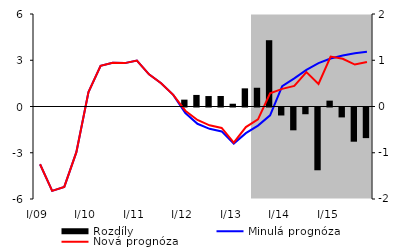
| Category | Rozdíly |
|---|---|
| 0 | 0 |
| 1 | 0 |
| 2 | 0 |
| 3 | 0 |
| 4 | 0 |
| 5 | 0 |
| 6 | 0 |
| 7 | 0 |
| 8 | 0 |
| 9 | 0 |
| 10 | 0 |
| 11 | 0 |
| 12 | 0.148 |
| 13 | 0.25 |
| 14 | 0.226 |
| 15 | 0.228 |
| 16 | 0.06 |
| 17 | 0.392 |
| 18 | 0.405 |
| 19 | 1.433 |
| 20 | -0.173 |
| 21 | -0.493 |
| 22 | -0.146 |
| 23 | -1.357 |
| 24 | 0.127 |
| 25 | -0.214 |
| 26 | -0.74 |
| 27 | -0.662 |